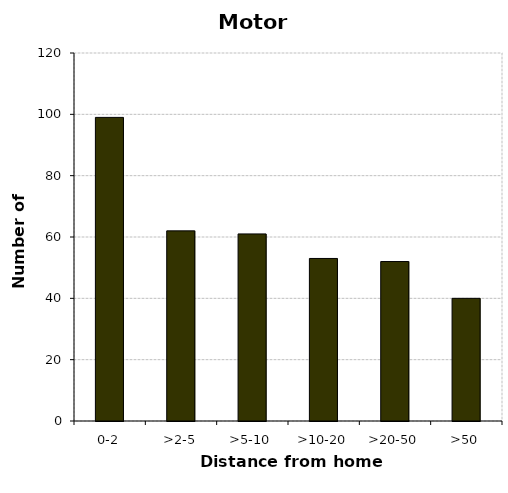
| Category | Motorcycles |
|---|---|
| 0-2 | 99 |
| >2-5 | 62 |
| >5-10 | 61 |
| >10-20 | 53 |
| >20-50 | 52 |
| >50 | 40 |